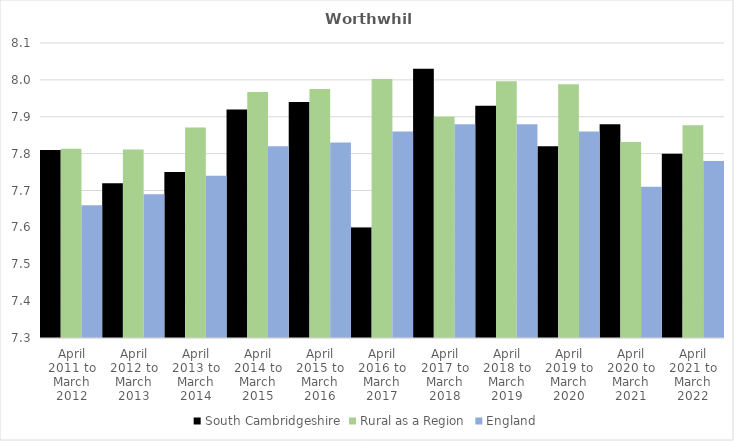
| Category | South Cambridgeshire | Rural as a Region | England |
|---|---|---|---|
| April 2011 to March 2012 | 7.81 | 7.813 | 7.66 |
| April 2012 to March 2013 | 7.72 | 7.811 | 7.69 |
| April 2013 to March 2014 | 7.75 | 7.871 | 7.74 |
| April 2014 to March 2015 | 7.92 | 7.967 | 7.82 |
| April 2015 to March 2016 | 7.94 | 7.975 | 7.83 |
| April 2016 to March 2017 | 7.6 | 8.002 | 7.86 |
| April 2017 to March 2018 | 8.03 | 7.9 | 7.88 |
| April 2018 to March 2019 | 7.93 | 7.996 | 7.88 |
| April 2019 to March 2020 | 7.82 | 7.988 | 7.86 |
| April 2020 to March 2021 | 7.88 | 7.831 | 7.71 |
| April 2021 to March 2022 | 7.8 | 7.877 | 7.78 |